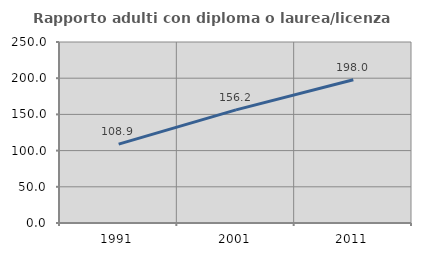
| Category | Rapporto adulti con diploma o laurea/licenza media  |
|---|---|
| 1991.0 | 108.936 |
| 2001.0 | 156.228 |
| 2011.0 | 197.959 |